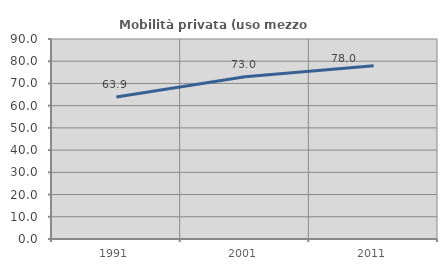
| Category | Mobilità privata (uso mezzo privato) |
|---|---|
| 1991.0 | 63.93 |
| 2001.0 | 73.006 |
| 2011.0 | 78.005 |